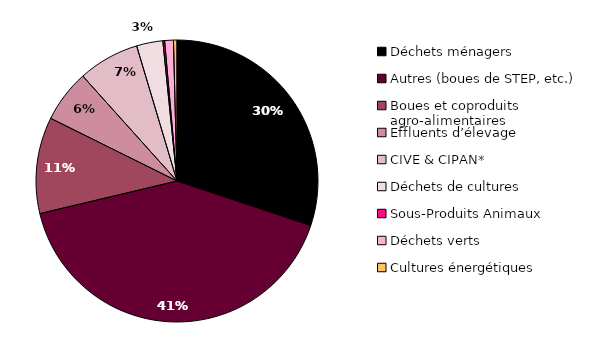
| Category | Gisement en masse utilisé pour la production de biométhane en 2016 |
|---|---|
| Déchets ménagers | 0.3 |
| Autres (boues de STEP, etc.) | 0.41 |
| Boues et coproduits agro-alimentaires | 0.11 |
| Effluents d’élevage | 0.06 |
| CIVE & CIPAN* | 0.07 |
| Déchets de cultures | 0.03 |
| Sous-Produits Animaux | 0.002 |
| Déchets verts | 0.01 |
| Cultures énergétiques | 0.004 |